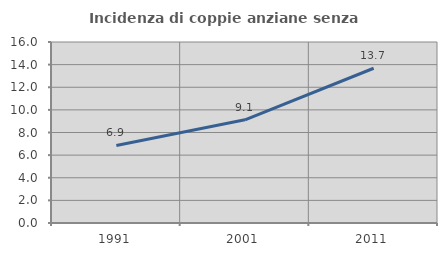
| Category | Incidenza di coppie anziane senza figli  |
|---|---|
| 1991.0 | 6.859 |
| 2001.0 | 9.124 |
| 2011.0 | 13.678 |